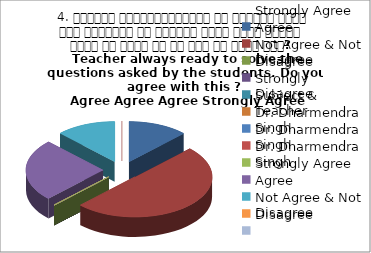
| Category | 4. शिक्षक विद्यार्थियों के द्वारा पूछे गये प्रश्नो का समाधान करने हेतु तत्पर  रहते है क्या आप इस बात से सहमत हैं? 
 Teacher always ready to solve the questions asked by the students. Do you agree with this ? 
 Agree Agree Agree Strongly Agree Agree |
|---|---|
| Strongly Agree | 1 |
| Agree | 4 |
| Not Agree & Not Disagree | 0 |
| Disagree | 0 |
| Strongly Disagree | 0 |
| Subject & Teacher | 0 |
| Dr. Dharmendra Singh | 0 |
| Dr. Dharmendra Singh | 0 |
| Dr. Dharmendra Singh | 0 |
| Strongly Agree | 2 |
| Agree | 1 |
| Not Agree & Not Disagree | 0 |
| Disagree | 0 |
| Strongly Disagree | 0 |